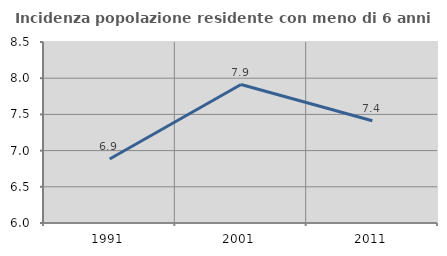
| Category | Incidenza popolazione residente con meno di 6 anni |
|---|---|
| 1991.0 | 6.885 |
| 2001.0 | 7.913 |
| 2011.0 | 7.413 |